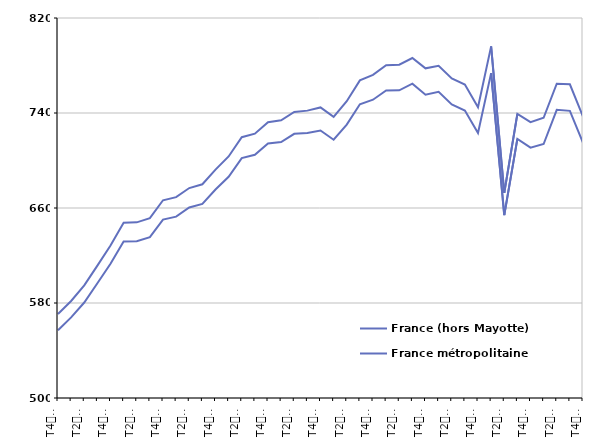
| Category | France (hors Mayotte) | France métropolitaine |
|---|---|---|
| T4
2011 | 570.8 | 557 |
| T1
2012 | 581.7 | 567.9 |
| T2
2012 | 594.8 | 580.4 |
| T3
2012 | 611.5 | 596.6 |
| T4
2012 | 628.4 | 613 |
| T1
2013 | 647.5 | 631.8 |
| T2
2013 | 647.9 | 632.1 |
| T3
2013 | 651.4 | 635.5 |
| T4
2013 | 666.5 | 650.2 |
| T1
2014 | 669.1 | 652.7 |
| T2
2014 | 676.8 | 660.4 |
| T3
2014 | 680 | 663.5 |
| T4
2014 | 692.3 | 675.6 |
| T1
2015 | 703.4 | 686.3 |
| T2
2015 | 719.6 | 702 |
| T3
2015 | 722.6 | 704.8 |
| T4
2015 | 732.3 | 714.4 |
| T1
2016 | 733.8 | 715.5 |
| T2
2016 | 740.9 | 722.5 |
| T3
2016 | 742 | 723.2 |
| T4
2016 | 744.7 | 725.3 |
| T1
2017 | 736.8 | 717.5 |
| T2
2017 | 749.9 | 730.2 |
| T3
2017 | 767.5 | 747.3 |
| T4
2017 | 772.1 | 751.2 |
| T1
2018 | 780.2 | 759 |
| T2
2018 | 780.7 | 759.1 |
| T3
2018 | 786.3 | 764.7 |
| T4
2018 | 777.6 | 755.4 |
| T1
2019 | 779.8 | 757.8 |
| T2
2019 | 769.1 | 747.2 |
| T3
2019 | 764 | 742.1 |
| T4
2019 | 744.9 | 723.2 |
| T1
2020 | 796.1 | 773.6 |
| T2
2020 | 672.7 | 654 |
| T3
2020 | 739.2 | 718.2 |
| T4
2020 | 732.3 | 710.8 |
| T1
2021 | 736 | 713.9 |
| T2
2021 | 764.7 | 742.7 |
| T3
2021 | 764.2 | 741.8 |
| T4
2021 | 737 | 715 |